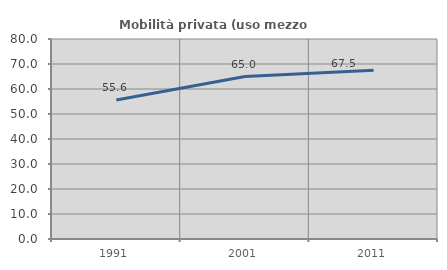
| Category | Mobilità privata (uso mezzo privato) |
|---|---|
| 1991.0 | 55.597 |
| 2001.0 | 64.986 |
| 2011.0 | 67.484 |